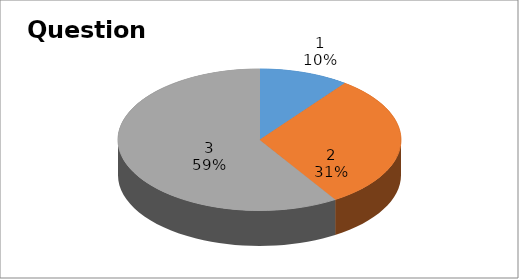
| Category | Series 0 |
|---|---|
| 0 | 4 |
| 1 | 12 |
| 2 | 23 |